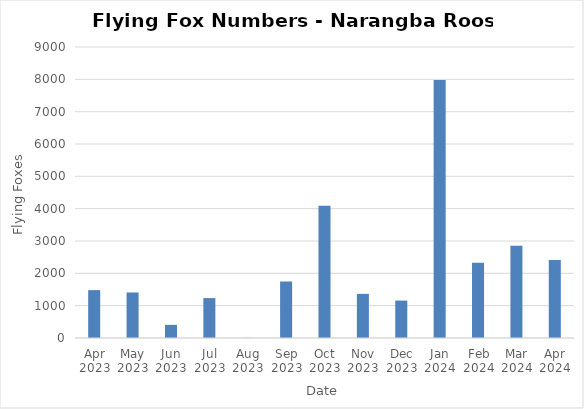
| Category | Flying-foxes |
|---|---|
| Apr 2023 | 1481 |
| May 2023 | 1408 |
| Jun 2023 | 407 |
| Jul 2023 | 1234 |
| Aug 2023 | 4 |
| Sep 2023 | 1748 |
| Oct 2023 | 4088 |
| Nov 2023 | 1366 |
| Dec 2023 | 1157 |
| Jan 2024 | 7976 |
| Feb 2024 | 2331 |
| Mar 2024 | 2856 |
| Apr 2024 | 2410 |